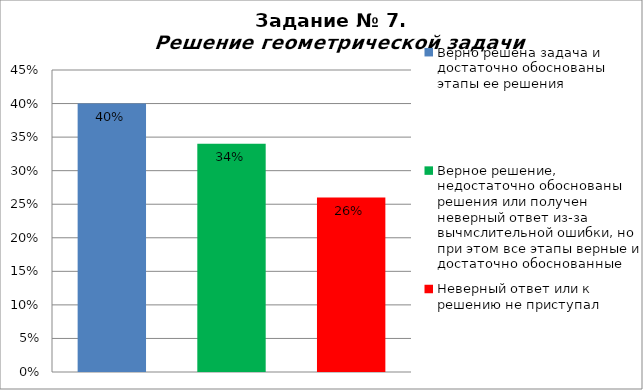
| Category | Решение геометрической задачи  |
|---|---|
| Верно решена задача и достаточно обоснованы этапы ее решения | 0.4 |
| Верное решение, недостаточно обоснованы решения или получен неверный ответ из-за вычмслительной ошибки, но при этом все этапы верные и достаточно обоснованные | 0.34 |
| Неверный ответ или к решению не приступал | 0.26 |